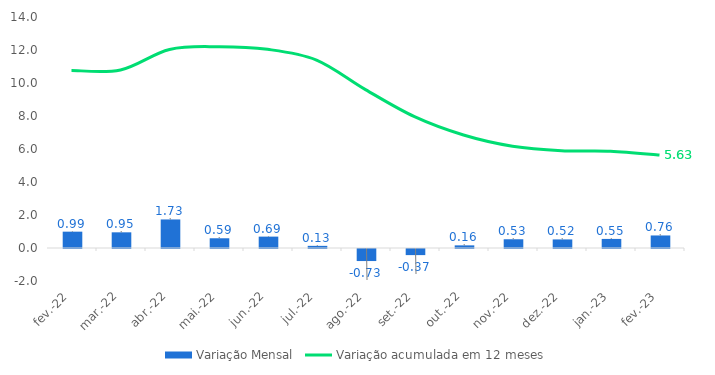
| Category | Variação Mensal |
|---|---|
| 2022-02-01 | 0.99 |
| 2022-03-01 | 0.95 |
| 2022-04-01 | 1.73 |
| 2022-05-01 | 0.59 |
| 2022-06-01 | 0.69 |
| 2022-07-01 | 0.13 |
| 2022-08-01 | -0.73 |
| 2022-09-01 | -0.37 |
| 2022-10-01 | 0.16 |
| 2022-11-01 | 0.53 |
| 2022-12-01 | 0.52 |
| 2023-01-01 | 0.55 |
| 2023-02-01 | 0.76 |